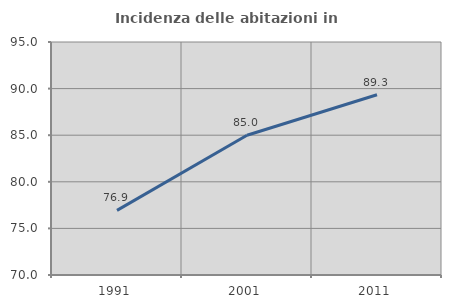
| Category | Incidenza delle abitazioni in proprietà  |
|---|---|
| 1991.0 | 76.934 |
| 2001.0 | 84.99 |
| 2011.0 | 89.334 |